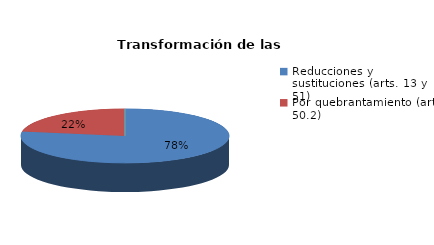
| Category | Series 0 |
|---|---|
| Reducciones y sustituciones (arts. 13 y 51) | 128 |
| Por quebrantamiento (art. 50.2) | 37 |
| Cancelaciones anticipadas | 0 |
| Traslado a Centros Penitenciarios | 0 |
| Conversión internamientos en cerrados (art. 51.2) | 0 |